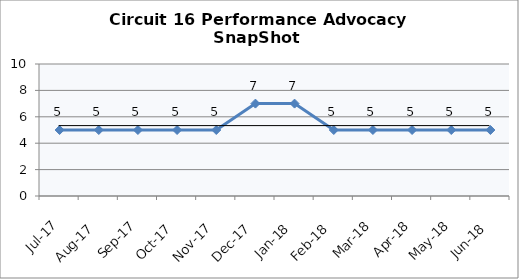
| Category | Circuit 16 |
|---|---|
| Jul-17 | 5 |
| Aug-17 | 5 |
| Sep-17 | 5 |
| Oct-17 | 5 |
| Nov-17 | 5 |
| Dec-17 | 7 |
| Jan-18 | 7 |
| Feb-18 | 5 |
| Mar-18 | 5 |
| Apr-18 | 5 |
| May-18 | 5 |
| Jun-18 | 5 |